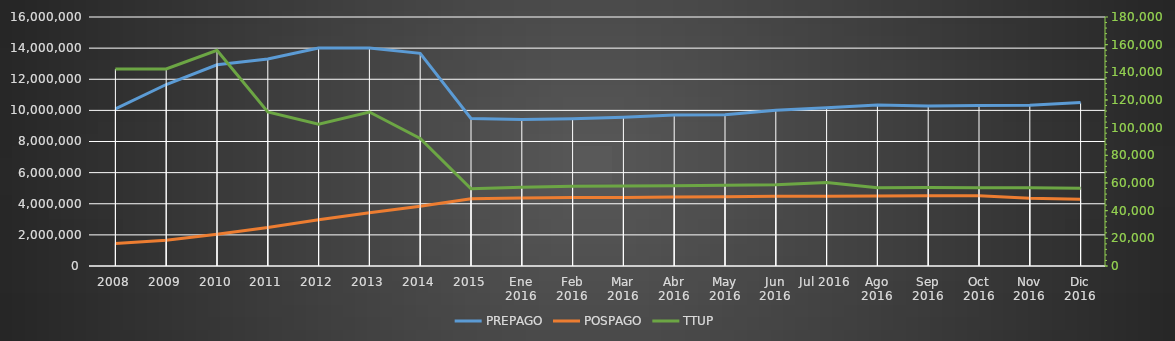
| Category | PREPAGO | POSPAGO |
|---|---|---|
| 2008 | 10097768 | 1452088 |
| 2009 | 11662294 | 1649838 |
| 2010 | 12929040 | 2033814 |
| 2011 | 13295834 | 2467378 |
| 2012 | 14008104 | 2976194 |
| 2013 | 14005126 | 3425277 |
| 2014 | 13666071 | 3846271 |
| 2015 | 9476240 | 4326937 |
| Ene 2016 | 9414069 | 4363041 |
| Feb 2016 | 9461143 | 4403744 |
| Mar 2016 | 9559280 | 4405629 |
| Abr 2016 | 9695379 | 4438022 |
| May 2016 | 9714309 | 4454361 |
| Jun 2016 | 10003869 | 4477370 |
| Jul 2016 | 10174392 | 4486818 |
| Ago 2016 | 10348607 | 4503084 |
| Sep 2016 | 10280609 | 4507228 |
| Oct 2016 | 10308394 | 4509498 |
| Nov 2016 | 10336712 | 4349057 |
| Dic 2016 | 10498467 | 4293426 |